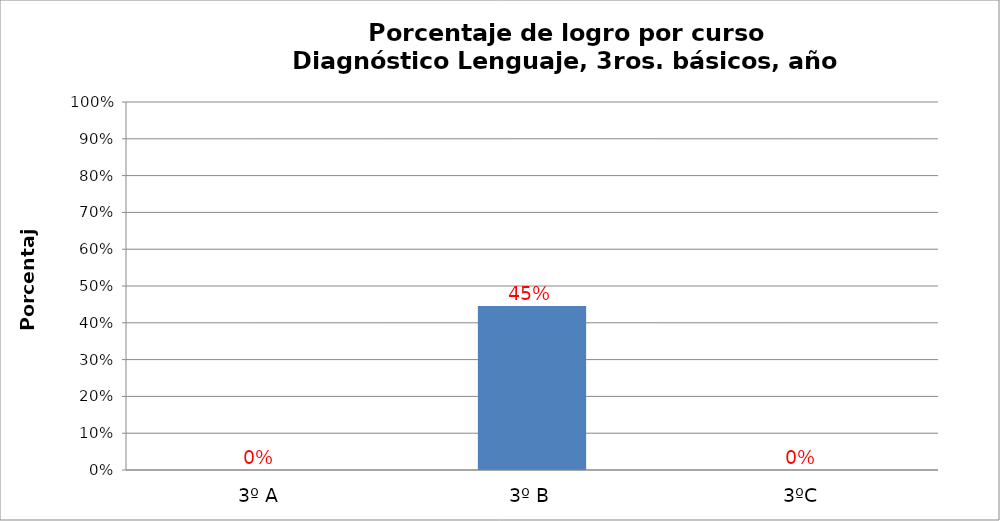
| Category | Series 0 |
|---|---|
| 3º A | 0 |
| 3º B | 0.446 |
| 3ºC | 0 |